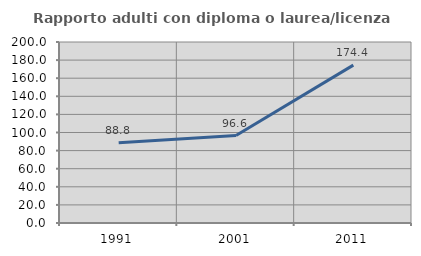
| Category | Rapporto adulti con diploma o laurea/licenza media  |
|---|---|
| 1991.0 | 88.75 |
| 2001.0 | 96.629 |
| 2011.0 | 174.409 |